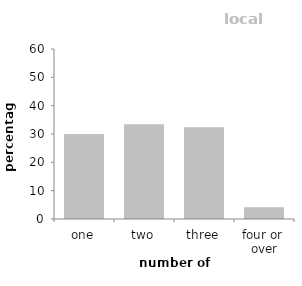
| Category | local authority |
|---|---|
| one | 30.034 |
| two | 33.452 |
| three | 32.34 |
| four or 
over | 4.174 |